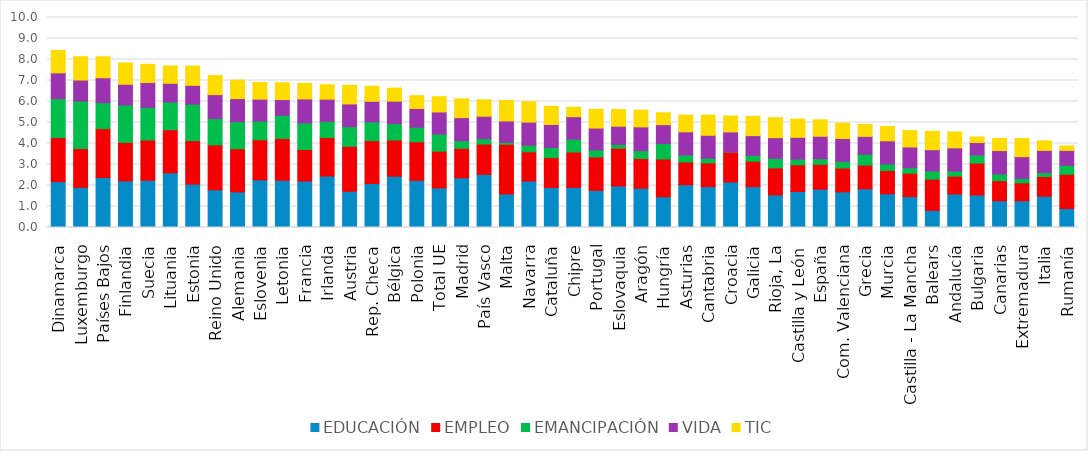
| Category | EDUCACIÓN | EMPLEO | EMANCIPACIÓN | VIDA | TIC |
|---|---|---|---|---|---|
| Dinamarca | 2.185 | 2.095 | 1.855 | 1.231 | 1.067 |
| Luxemburgo | 1.912 | 1.848 | 2.264 | 1 | 1.107 |
| Países Bajos | 2.382 | 2.327 | 1.239 | 1.182 | 0.997 |
| Finlandia | 2.22 | 1.83 | 1.789 | 0.983 | 1.012 |
| Suecia | 2.248 | 1.916 | 1.558 | 1.181 | 0.869 |
| Lituania | 2.605 | 2.052 | 1.325 | 0.885 | 0.825 |
| Estonia | 2.066 | 2.073 | 1.735 | 0.895 | 0.92 |
| Reino Unido | 1.794 | 2.141 | 1.253 | 1.138 | 0.906 |
| Alemania | 1.695 | 2.056 | 1.289 | 1.097 | 0.878 |
| Eslovenia | 2.27 | 1.906 | 0.895 | 1.04 | 0.795 |
| Letonia | 2.25 | 1.989 | 1.104 | 0.749 | 0.798 |
| Francia | 2.215 | 1.499 | 1.267 | 1.141 | 0.742 |
| Irlanda | 2.449 | 1.834 | 0.773 | 1.054 | 0.688 |
| Austria | 1.726 | 2.14 | 0.936 | 1.082 | 0.89 |
| Rep. Checa | 2.095 | 2.041 | 0.895 | 0.977 | 0.717 |
| Bélgica | 2.443 | 1.723 | 0.782 | 1.068 | 0.622 |
| Polonia | 2.245 | 1.837 | 0.693 | 0.894 | 0.61 |
| Total UE | 1.886 | 1.75 | 0.818 | 1.049 | 0.728 |
| Madrid | 2.366 | 1.407 | 0.359 | 1.101 | 0.898 |
| País Vasco | 2.534 | 1.439 | 0.255 | 1.072 | 0.783 |
| Malta | 1.6 | 2.366 | 0.094 | 1.015 | 0.973 |
| Navarra | 2.211 | 1.393 | 0.318 | 1.096 | 0.972 |
| Cataluña | 1.906 | 1.423 | 0.482 | 1.095 | 0.862 |
| Chipre | 1.912 | 1.682 | 0.616 | 1.067 | 0.45 |
| Portugal | 1.768 | 1.59 | 0.336 | 1.04 | 0.892 |
| Eslovaquia | 1.978 | 1.801 | 0.179 | 0.865 | 0.795 |
| Aragón | 1.87 | 1.415 | 0.378 | 1.128 | 0.796 |
| Hungría | 1.462 | 1.799 | 0.741 | 0.895 | 0.565 |
| Asturias | 2.036 | 1.084 | 0.334 | 1.103 | 0.796 |
| Cantabria | 1.947 | 1.131 | 0.225 | 1.089 | 0.959 |
| Croacia | 2.17 | 1.42 | 0.011 | 0.95 | 0.759 |
| Galicia | 1.944 | 1.213 | 0.28 | 0.937 | 0.914 |
| Rioja, La | 1.553 | 1.286 | 0.457 | 0.983 | 0.949 |
| Castilla y León | 1.715 | 1.271 | 0.269 | 1.04 | 0.866 |
| España | 1.824 | 1.183 | 0.27 | 1.067 | 0.783 |
| Com. Valenciana | 1.697 | 1.134 | 0.324 | 1.084 | 0.724 |
| Grecia | 1.843 | 1.128 | 0.517 | 0.851 | 0.566 |
| Murcia | 1.607 | 1.109 | 0.309 | 1.104 | 0.677 |
| Castilla - La Mancha | 1.474 | 1.111 | 0.262 | 0.987 | 0.782 |
| Balears | 0.815 | 1.491 | 0.389 | 1.009 | 0.873 |
| Andalucía | 1.593 | 0.852 | 0.241 | 1.106 | 0.756 |
| Bulgaria | 1.547 | 1.52 | 0.386 | 0.591 | 0.265 |
| Canarias | 1.269 | 0.961 | 0.322 | 1.111 | 0.578 |
| Extremadura | 1.272 | 0.855 | 0.213 | 1.033 | 0.864 |
| Italia | 1.489 | 0.94 | 0.184 | 1.058 | 0.454 |
| Rumanía | 0.902 | 1.632 | 0.43 | 0.706 | 0.214 |